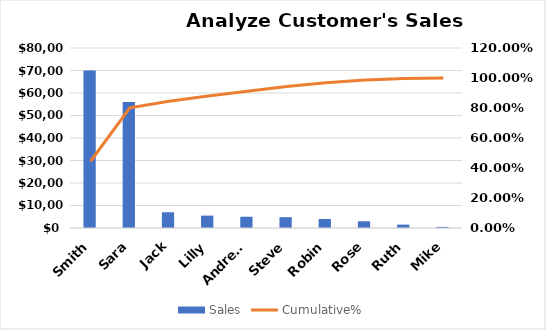
| Category | Sales |
|---|---|
| Smith | 70000 |
| Sara | 56000 |
| Jack | 7000 |
| Lilly | 5500 |
| Andrew | 5000 |
| Steve | 4800 |
| Robin | 4000 |
| Rose | 3000 |
| Ruth | 1500 |
| Mike | 500 |